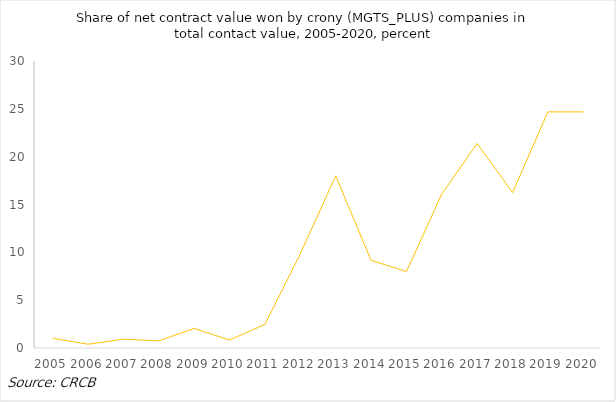
| Category | Series 0 |
|---|---|
| 2005.0 | 1.008 |
| 2006.0 | 0.395 |
| 2007.0 | 0.925 |
| 2008.0 | 0.75 |
| 2009.0 | 2.044 |
| 2010.0 | 0.837 |
| 2011.0 | 2.467 |
| 2012.0 | 9.842 |
| 2013.0 | 17.995 |
| 2014.0 | 9.162 |
| 2015.0 | 7.988 |
| 2016.0 | 16.105 |
| 2017.0 | 21.378 |
| 2018.0 | 16.249 |
| 2019.0 | 24.683 |
| 2020.0 | 24.681 |